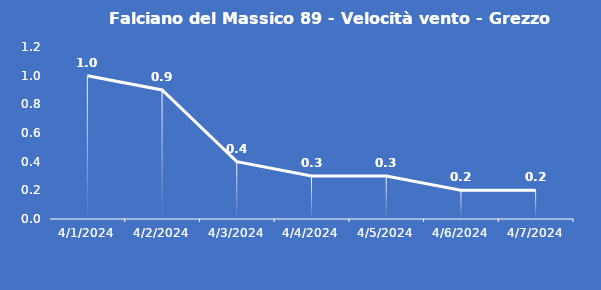
| Category | Falciano del Massico 89 - Velocità vento - Grezzo (m/s) |
|---|---|
| 4/1/24 | 1 |
| 4/2/24 | 0.9 |
| 4/3/24 | 0.4 |
| 4/4/24 | 0.3 |
| 4/5/24 | 0.3 |
| 4/6/24 | 0.2 |
| 4/7/24 | 0.2 |